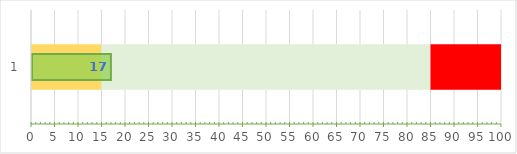
| Category | Series 1 | Series 2 | Series 3 | Series 4 |
|---|---|---|---|---|
| 0 | 15 | 70 | 25 |  |